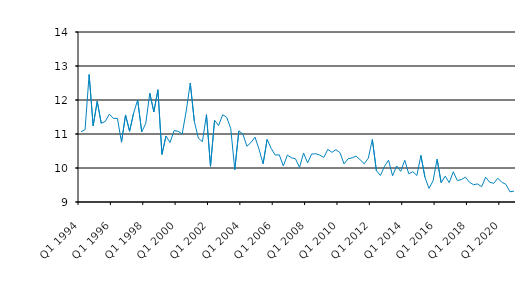
| Category | Series 0 |
|---|---|
| Q1 1994 | 11.067 |
| Q2 1994 | 11.129 |
| Q3 1994 | 12.75 |
| Q4 1994 | 11.238 |
| Q1 1995 | 11.961 |
| Q2 1995 | 11.316 |
| Q3 1995 | 11.37 |
| Q4 1995 | 11.583 |
| Q1 1996 | 11.46 |
| Q2 1996 | 11.458 |
| Q3 1996 | 10.759 |
| Q4 1996 | 11.56 |
| Q1 1997 | 11.08 |
| Q2 1997 | 11.616 |
| Q3 1997 | 12 |
| Q4 1997 | 11.059 |
| Q1 1998 | 11.312 |
| Q2 1998 | 12.199 |
| Q3 1998 | 11.649 |
| Q4 1998 | 12.3 |
| Q1 1999 | 10.4 |
| Q2 1999 | 10.939 |
| Q3 1999 | 10.75 |
| Q4 1999 | 11.1 |
| Q1 2000 | 11.08 |
| Q2 2000 | 11 |
| Q3 2000 | 11.679 |
| Q4 2000 | 12.5 |
| Q1 2001 | 11.375 |
| Q2 2001 | 10.875 |
| Q3 2001 | 10.775 |
| Q4 2001 | 11.57 |
| Q1 2002 | 10.05 |
| Q2 2002 | 11.405 |
| Q3 2002 | 11.25 |
| Q4 2002 | 11.566 |
| Q1 2003 | 11.492 |
| Q2 2003 | 11.162 |
| Q3 2003 | 9.95 |
| Q4 2003 | 11.091 |
| Q1 2004 | 11 |
| Q2 2004 | 10.638 |
| Q3 2004 | 10.75 |
| Q4 2004 | 10.908 |
| Q1 2005 | 10.55 |
| Q2 2005 | 10.125 |
| Q3 2005 | 10.843 |
| Q4 2005 | 10.573 |
| Q1 2006 | 10.38 |
| Q2 2006 | 10.387 |
| Q3 2006 | 10.06 |
| Q4 2006 | 10.38 |
| Q1 2007 | 10.3 |
| Q2 2007 | 10.27 |
| Q3 2007 | 10.017 |
| Q4 2007 | 10.44 |
| Q1 2008 | 10.15 |
| Q2 2008 | 10.41 |
| Q3 2008 | 10.42 |
| Q4 2008 | 10.38 |
| Q1 2009 | 10.31 |
| Q2 2009 | 10.55 |
| Q3 2009 | 10.46 |
| Q4 2009 | 10.54 |
| Q1 2010 | 10.45 |
| Q2 2010 | 10.12 |
| Q3 2010 | 10.27 |
| Q4 2010 | 10.3 |
| Q1 2011 | 10.35 |
| Q2 2011 | 10.24 |
| Q3 2011 | 10.125 |
| Q4 2011 | 10.29 |
| Q1 2012 | 10.84 |
| Q2 2012 | 9.92 |
| Q3 2012 | 9.78 |
| Q4 2012 | 10.05 |
| Q1 2013 | 10.23 |
| Q2 2013 | 9.77 |
| Q3 2013 | 10.06 |
| Q4 2013 | 9.9 |
| Q1 2014 | 10.23 |
| Q2 2014 | 9.83 |
| Q3 2014 | 9.89 |
| Q4 2014 | 9.78 |
| Q1 2015 | 10.37 |
| Q2 2015 | 9.726 |
| Q3 2015 | 9.4 |
| Q4 2015 | 9.62 |
| Q1 2016 | 10.26 |
| Q2 2016 | 9.57 |
| Q3 2016 | 9.76 |
| Q4 2016 | 9.57 |
| Q1 2017 | 9.89 |
| Q2 2017 | 9.63 |
| Q3 2017 | 9.66 |
| Q4 2017 | 9.73 |
| Q1 2018 | 9.58 |
| Q2 2018 | 9.51 |
| Q3 2018 | 9.53 |
| Q4 2018 | 9.45 |
| Q1 2019 | 9.73 |
| Q2 2019 | 9.58 |
| Q3 2019 | 9.55 |
| Q4 2019 | 9.7 |
| Q1 2020 | 9.58 |
| Q2 2020 | 9.52 |
| Q3 2020 | 9.3 |
| Q4 2020 | 9.32 |